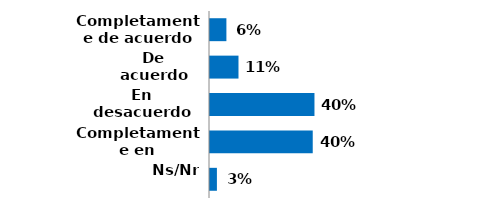
| Category | Series 0 |
|---|---|
| Completamente de acuerdo | 0.063 |
| De acuerdo | 0.11 |
| En desacuerdo | 0.403 |
| Completamente en desacuerdo | 0.397 |
| Ns/Nr | 0.027 |